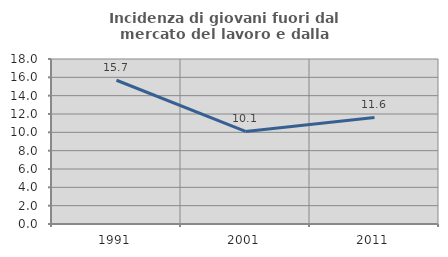
| Category | Incidenza di giovani fuori dal mercato del lavoro e dalla formazione  |
|---|---|
| 1991.0 | 15.68 |
| 2001.0 | 10.1 |
| 2011.0 | 11.628 |